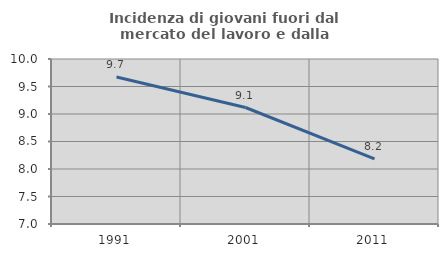
| Category | Incidenza di giovani fuori dal mercato del lavoro e dalla formazione  |
|---|---|
| 1991.0 | 9.671 |
| 2001.0 | 9.118 |
| 2011.0 | 8.183 |